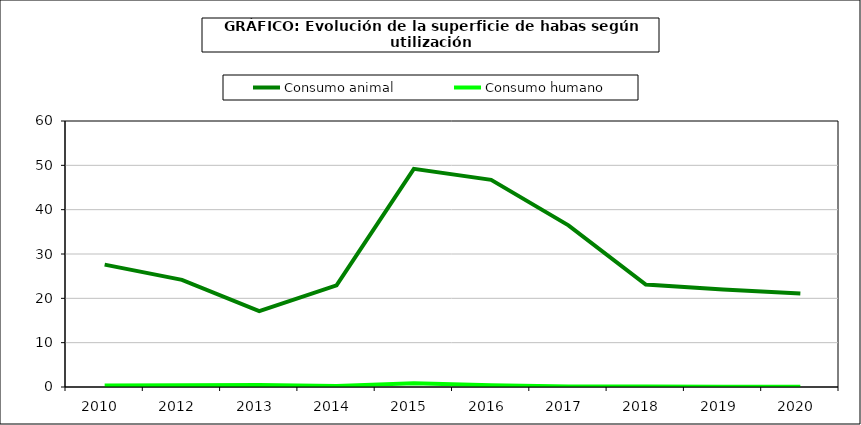
| Category | Consumo animal | Consumo humano |
|---|---|---|
| 2010  | 27.596 | 0.361 |
| 2012  | 24.156 | 0.408 |
| 2013  | 17.1 | 0.442 |
| 2014  | 22.918 | 0.247 |
| 2015  | 49.204 | 0.868 |
| 2016  | 46.723 | 0.386 |
| 2017  | 36.47 | 0.104 |
| 2018  | 23.126 | 0.108 |
| 2019  | 21.994 | 0.071 |
| 2020  | 21.079 | 0.067 |